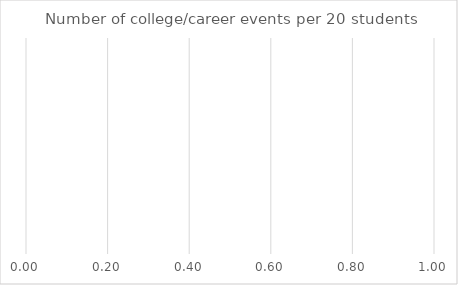
| Category | Benchmark | Entire LEA  | Title IV-A Identified Schools |
|---|---|---|---|
| Number of college/career events per 20 students | 0 | 0 | 0 |